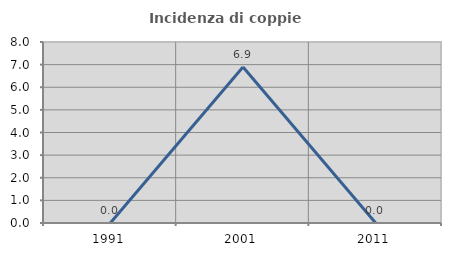
| Category | Incidenza di coppie miste |
|---|---|
| 1991.0 | 0 |
| 2001.0 | 6.897 |
| 2011.0 | 0 |